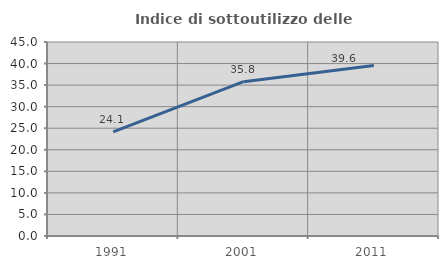
| Category | Indice di sottoutilizzo delle abitazioni  |
|---|---|
| 1991.0 | 24.149 |
| 2001.0 | 35.798 |
| 2011.0 | 39.553 |